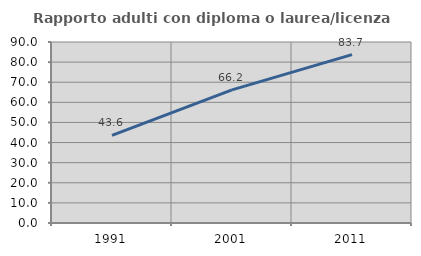
| Category | Rapporto adulti con diploma o laurea/licenza media  |
|---|---|
| 1991.0 | 43.614 |
| 2001.0 | 66.195 |
| 2011.0 | 83.748 |